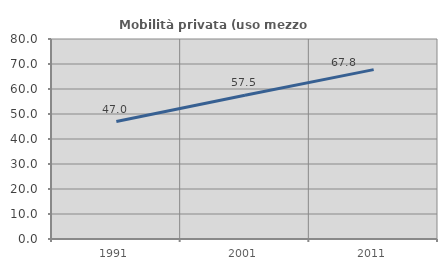
| Category | Mobilità privata (uso mezzo privato) |
|---|---|
| 1991.0 | 47 |
| 2001.0 | 57.503 |
| 2011.0 | 67.756 |